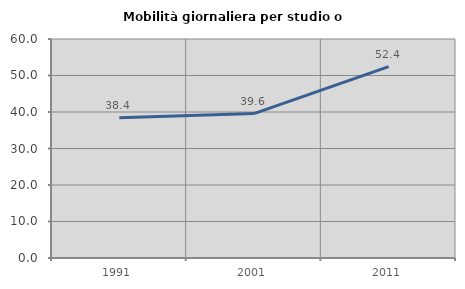
| Category | Mobilità giornaliera per studio o lavoro |
|---|---|
| 1991.0 | 38.424 |
| 2001.0 | 39.56 |
| 2011.0 | 52.448 |